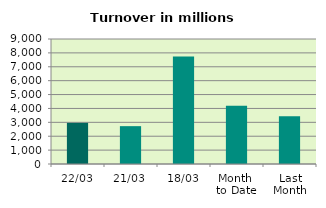
| Category | Series 0 |
|---|---|
| 22/03 | 2962.478 |
| 21/03 | 2725.054 |
| 18/03 | 7736.644 |
| Month 
to Date | 4191.923 |
| Last
Month | 3445.759 |